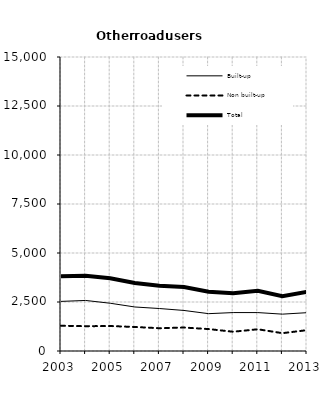
| Category | Built-up | Non built-up | Total |
|---|---|---|---|
| 2003.0 | 2531 | 1288 | 3819 |
| 2004.0 | 2579 | 1266 | 3845 |
| 2005.0 | 2437 | 1274 | 3711 |
| 2006.0 | 2246 | 1226 | 3472 |
| 2007.0 | 2167 | 1162 | 3329 |
| 2008.0 | 2068 | 1197 | 3265 |
| 2009.0 | 1905 | 1119 | 3024 |
| 2010.0 | 1961 | 983 | 2944 |
| 2011.0 | 1960 | 1109 | 3069 |
| 2012.0 | 1880 | 910 | 2790 |
| 2013.0 | 1954.8 | 1063.6 | 3018.4 |